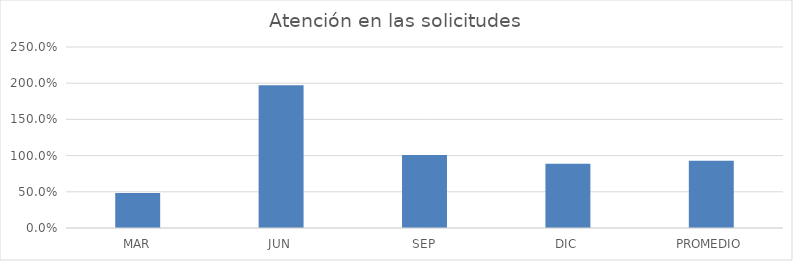
| Category | Series 0 |
|---|---|
| MAR | 0.483 |
| JUN | 1.973 |
| SEP | 1.009 |
| DIC | 0.889 |
| PROMEDIO | 0.928 |